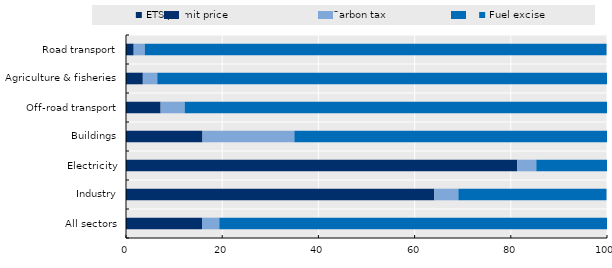
| Category | ETS permit price | Carbon tax | Fuel excise |
|---|---|---|---|
| All sectors | 15.8 | 3.6 | 80.6 |
| Industry | 64.1 | 5 | 30.8 |
| Electricity | 81.3 | 4 | 14.7 |
| Buildings | 15.9 | 19.1 | 65 |
| Off-road transport | 7.2 | 5 | 87.8 |
| Agriculture & fisheries | 3.5 | 3 | 93.5 |
| Road transport | 1.6 | 2.3 | 96 |